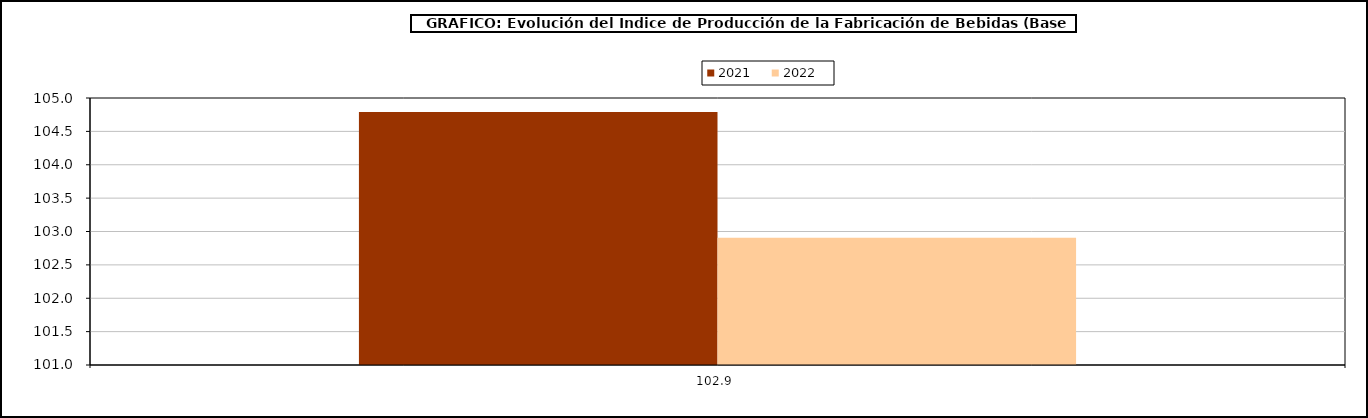
| Category | 2021 | 2022 |
|---|---|---|
| 102.908 | 104.791 | 102.908 |